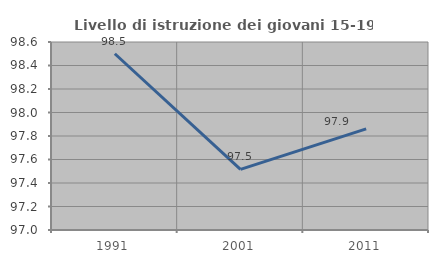
| Category | Livello di istruzione dei giovani 15-19 anni |
|---|---|
| 1991.0 | 98.5 |
| 2001.0 | 97.516 |
| 2011.0 | 97.861 |